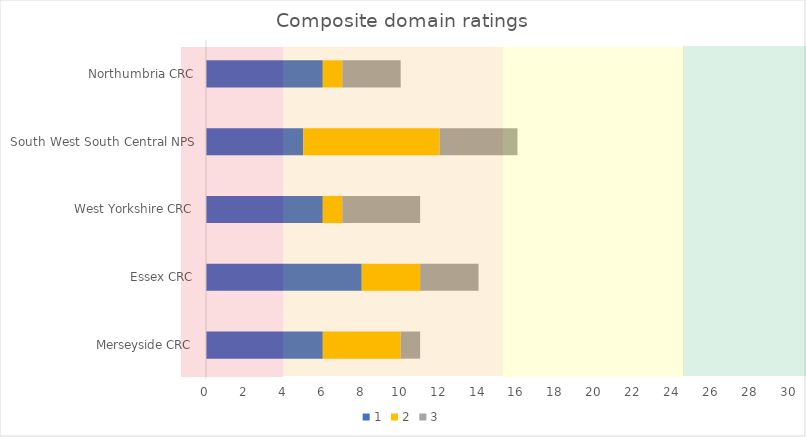
| Category | 1 | 2 | 3 |
|---|---|---|---|
| Merseyside CRC | 6 | 4 | 1 |
| Essex CRC | 8 | 3 | 3 |
| West Yorkshire CRC | 6 | 1 | 4 |
| South West South Central NPS | 5 | 7 | 4 |
| Northumbria CRC | 6 | 1 | 3 |